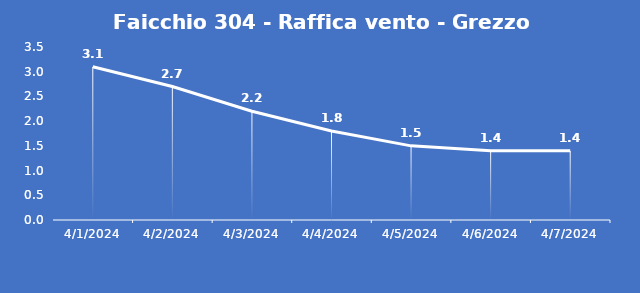
| Category | Faicchio 304 - Raffica vento - Grezzo (m/s) |
|---|---|
| 4/1/24 | 3.1 |
| 4/2/24 | 2.7 |
| 4/3/24 | 2.2 |
| 4/4/24 | 1.8 |
| 4/5/24 | 1.5 |
| 4/6/24 | 1.4 |
| 4/7/24 | 1.4 |